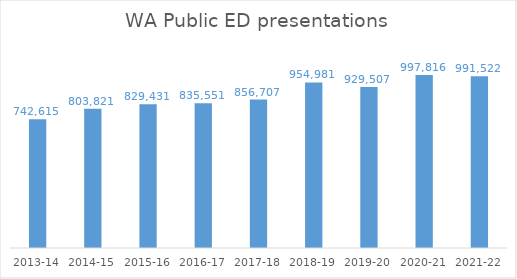
| Category | WA Public ED presentations |
|---|---|
| 2013-14 | 742615 |
| 2014-15 | 803821 |
| 2015-16 | 829431 |
| 2016-17 | 835551 |
| 2017-18 | 856707 |
| 2018-19 | 954981 |
| 2019-20 | 929507 |
| 2020-21 | 997816 |
| 2021-22 | 991522 |